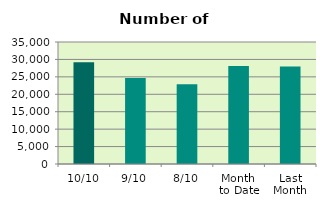
| Category | Series 0 |
|---|---|
| 10/10 | 29222 |
| 9/10 | 24678 |
| 8/10 | 22870 |
| Month 
to Date | 28089.5 |
| Last
Month | 27963.2 |